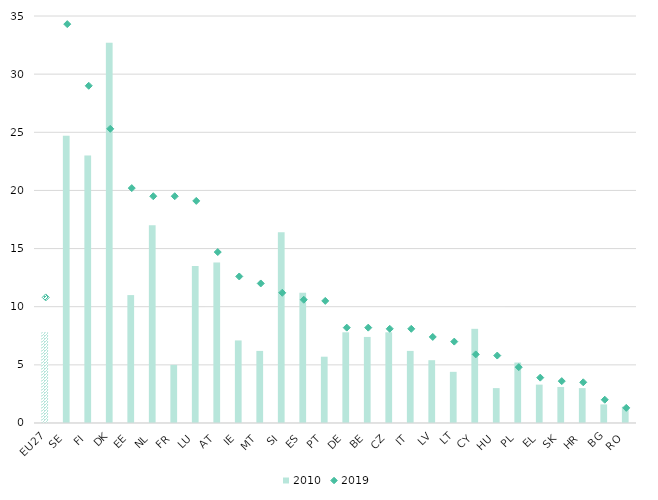
| Category | 2010 |
|---|---|
| EU27 | 7.8 |
| SE | 24.7 |
| FI | 23 |
| DK | 32.7 |
| EE | 11 |
| NL | 17 |
| FR | 5 |
| LU | 13.5 |
| AT | 13.8 |
| IE | 7.1 |
| MT | 6.2 |
| SI | 16.4 |
| ES | 11.2 |
| PT | 5.7 |
| DE | 7.8 |
| BE | 7.4 |
| CZ | 7.8 |
| IT | 6.2 |
| LV | 5.4 |
| LT | 4.4 |
| CY | 8.1 |
| HU | 3 |
| PL | 5.2 |
| EL | 3.3 |
| SK | 3.1 |
| HR | 3 |
| BG | 1.6 |
| RO | 1.4 |